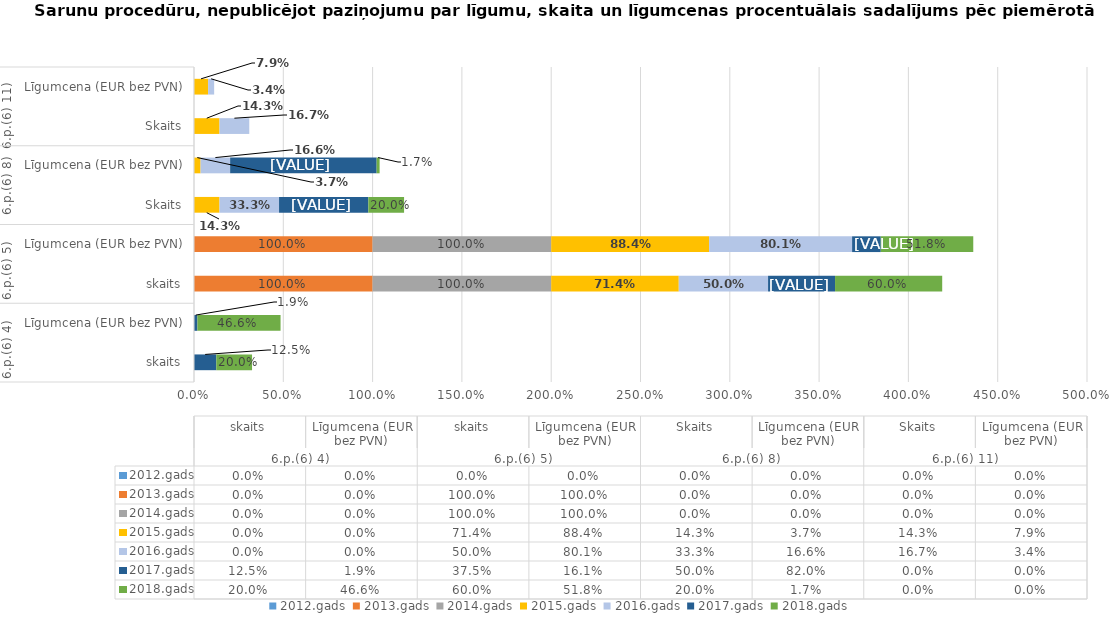
| Category | 2012.gads | 2013.gads | 2014.gads | 2015.gads | 2016.gads | 2017.gads | 2018.gads |
|---|---|---|---|---|---|---|---|
| 0 | 0 | 0 | 0 | 0 | 0 | 0.125 | 0.2 |
| 1 | 0 | 0 | 0 | 0 | 0 | 0.019 | 0.466 |
| 2 | 0 | 1 | 1 | 0.714 | 0.5 | 0.375 | 0.6 |
| 3 | 0 | 1 | 1 | 0.884 | 0.801 | 0.161 | 0.518 |
| 4 | 0 | 0 | 0 | 0.143 | 0.333 | 0.5 | 0.2 |
| 5 | 0 | 0 | 0 | 0.037 | 0.166 | 0.82 | 0.017 |
| 6 | 0 | 0 | 0 | 0.143 | 0.167 | 0 | 0 |
| 7 | 0 | 0 | 0 | 0.079 | 0.034 | 0 | 0 |